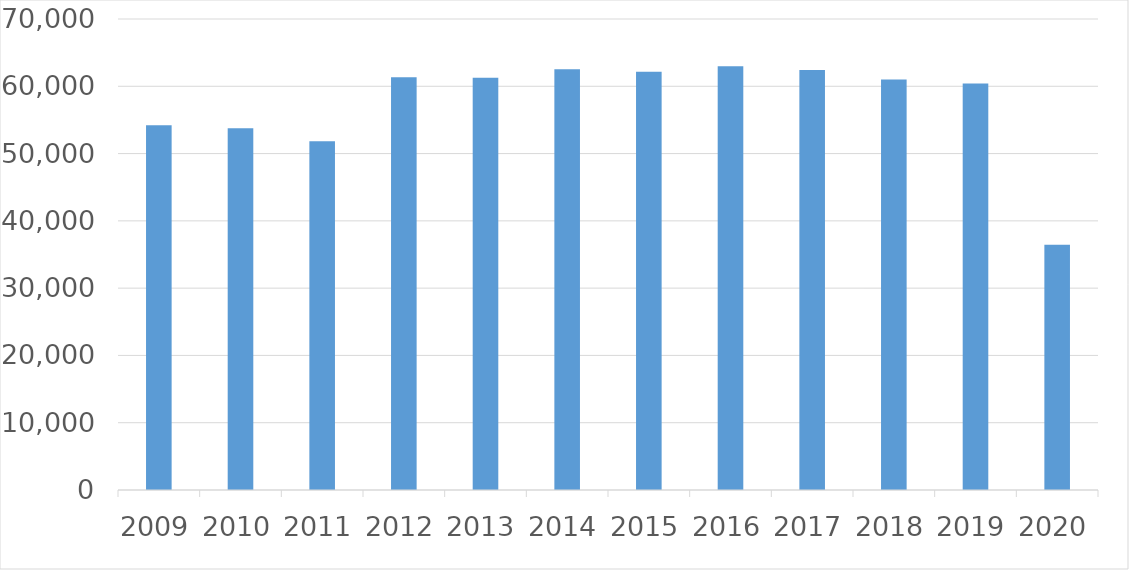
| Category | Series 0 |
|---|---|
| 2009 | 54194 |
| 2010 | 53747 |
| 2011 | 51832 |
| 2012 | 61331 |
| 2013 | 61259 |
| 2014 | 62521 |
| 2015 | 62157 |
| 2016 | 62969 |
| 2017 | 62402 |
| 2018 | 61014 |
| 2019 | 60424 |
| 2020 | 36442 |